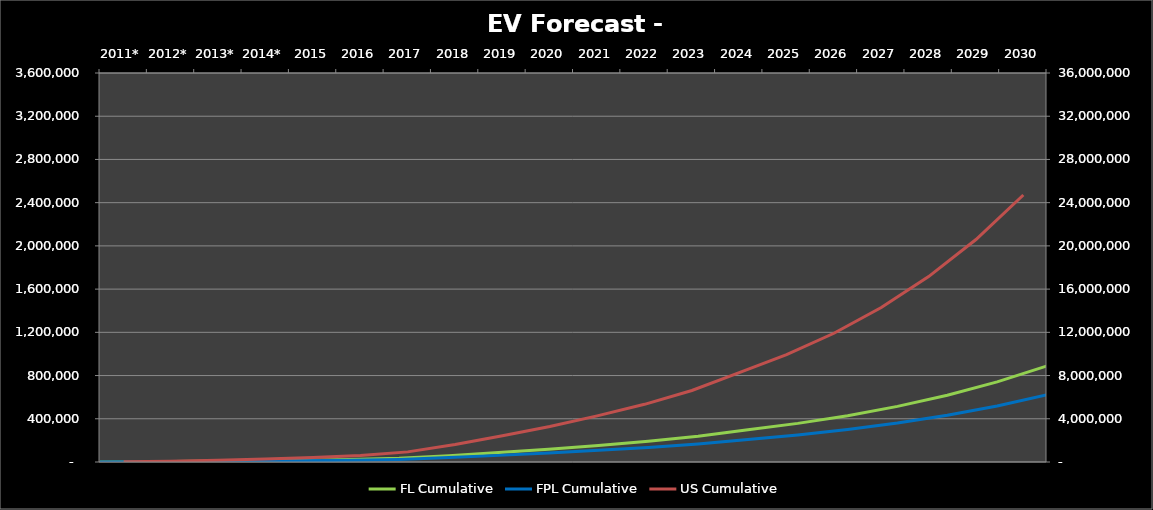
| Category | FL Cumulative | FPL Cumulative |
|---|---|---|
| 0 | 562 | 259 |
| 1 | 2539 | 1314 |
| 2 | 6377 | 4586 |
| 3 | 10068 | 7460 |
| 4 | 14895.432 | 10426.802 |
| 5 | 22023.432 | 15416.402 |
| 6 | 33707.196 | 23595.037 |
| 7 | 58402.44 | 40881.708 |
| 8 | 87603.66 | 61322.562 |
| 9 | 118264.941 | 82785.459 |
| 10 | 153744.423 | 107621.096 |
| 11 | 192180.529 | 134526.37 |
| 12 | 238303.856 | 166812.699 |
| 13 | 297879.82 | 208515.874 |
| 14 | 357455.784 | 250219.049 |
| 15 | 428946.941 | 300262.859 |
| 16 | 514736.329 | 360315.43 |
| 17 | 617683.595 | 432378.517 |
| 18 | 741220.314 | 518854.22 |
| 19 | 889464.377 | 622625.064 |